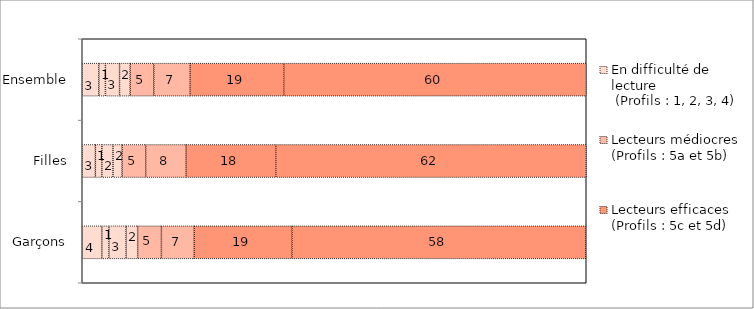
| Category | Series 7 | Series 6 | Series 5 | En difficulté de lecture
 (Profils : 1, 2, 3, 4) | Series 3 | Lecteurs médiocres
(Profils : 5a et 5b) | Series 1 | Lecteurs efficaces 
(Profils : 5c et 5d) |
|---|---|---|---|---|---|---|---|---|
| Garçons | 3.9 | 1.4 | 3.4 | 2.3 | 4.7 | 6.5 | 19.4 | 58.3 |
| Filles | 2.6 | 1.3 | 2.2 | 1.8 | 4.7 | 8 | 17.8 | 61.6 |
| Ensemble | 3.3 | 1.3 | 2.8 | 2.1 | 4.7 | 7.2 | 18.6 | 60 |